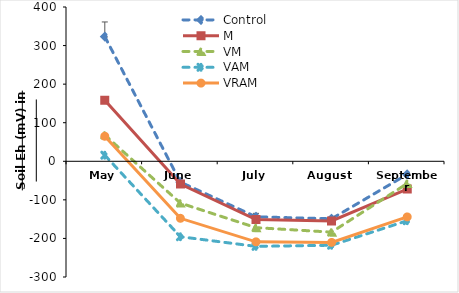
| Category | Control | M | VM | VAM | VRAM |
|---|---|---|---|---|---|
| May | 323.2 | 158.4 | 68.04 | 15.8 | 64.84 |
| June | -54 | -59.04 | -108.4 | -195.6 | -147.84 |
| July | -144 | -151.2 | -172.08 | -220.6 | -208.8 |
| August | -149.04 | -154.8 | -183.68 | -217.72 | -210.3 |
| September | -34 | -72 | -57.6 | -154 | -144.2 |